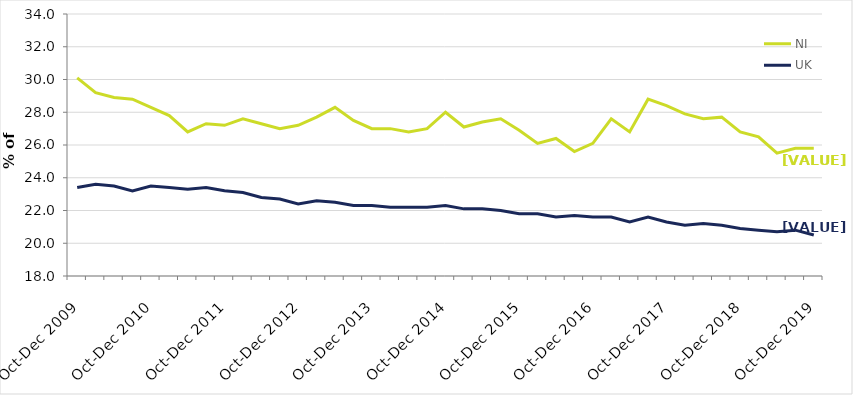
| Category | NI | UK |
|---|---|---|
| Oct-Dec 2009 | 30.1 | 23.4 |
| Jan-Mar 2010 | 29.2 | 23.6 |
| Apr-Jun 2010 | 28.9 | 23.5 |
| Jul-Sep 2010 | 28.8 | 23.2 |
| Oct-Dec 2010 | 28.3 | 23.5 |
| Jan-Mar 2011 | 27.8 | 23.4 |
| Apr-Jun 2011 | 26.8 | 23.3 |
| Jul-Sep 2011 | 27.3 | 23.4 |
| Oct-Dec 2011 | 27.2 | 23.2 |
| Jan-Mar 2012 | 27.6 | 23.1 |
| Apr-Jun 2012 | 27.3 | 22.8 |
| Jul-Sep 2012 | 27 | 22.7 |
| Oct-Dec 2012 | 27.2 | 22.4 |
| Jan-Mar 2013 | 27.7 | 22.6 |
| Apr-Jun 2013 | 28.3 | 22.5 |
| Jul-Sep 2013 | 27.5 | 22.3 |
| Oct-Dec 2013 | 27 | 22.3 |
| Jan-Mar 2014 | 27 | 22.2 |
| Apr-Jun 2014 | 26.8 | 22.2 |
| Jul-Sep 2014 | 27 | 22.2 |
| Oct-Dec 2014 | 28 | 22.3 |
| Jan-Mar 2015 | 27.1 | 22.1 |
| Apr-Jun 2015 | 27.4 | 22.1 |
| Jul-Sep 2015 | 27.6 | 22 |
| Oct-Dec 2015 | 26.9 | 21.8 |
| Jan-Mar 2016 | 26.1 | 21.8 |
| Apr-Jun 2016 | 26.4 | 21.6 |
| Jul-Sep 2016 | 25.6 | 21.7 |
| Oct-Dec 2016 | 26.1 | 21.6 |
| Jan-Mar 2017 | 27.6 | 21.6 |
| Apr-Jun 2017 | 26.8 | 21.3 |
| Jul-Sep 2017 | 28.8 | 21.6 |
| Oct-Dec 2017 | 28.4 | 21.3 |
| Jan-Mar 2018 | 27.9 | 21.1 |
| Apr-Jun 2018 | 27.6 | 21.2 |
| Jul-Sep 2018 | 27.7 | 21.1 |
| Oct-Dec 2018 | 26.8 | 20.9 |
| Jan-Mar 2019 | 26.5 | 20.8 |
| Apr-Jun 2019 | 25.5 | 20.7 |
| Jul-Sep 2019 | 25.8 | 20.8 |
| Oct-Dec 2019 | 25.8 | 20.5 |